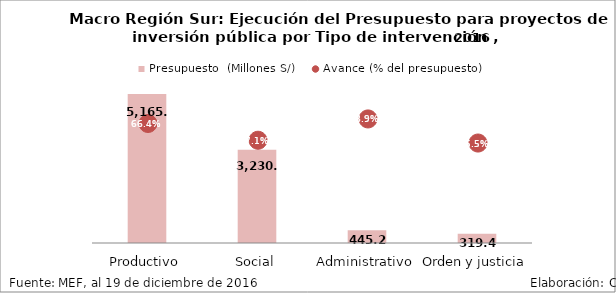
| Category | Presupuesto  (Millones S/) |
|---|---|
| Productivo | 5165.208 |
| Social | 3230.893 |
| Administrativo | 445.243 |
| Orden y justicia | 319.433 |